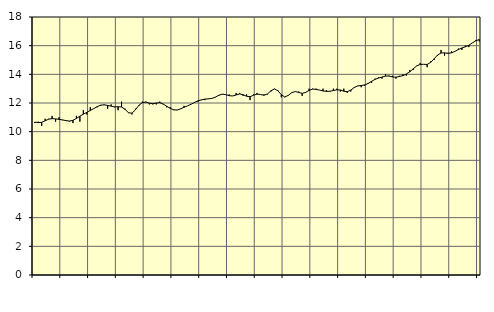
| Category | Piggar | Utbildning, SNI 85 |
|---|---|---|
| nan | 10.6 | 10.67 |
| 87.0 | 10.7 | 10.63 |
| 87.0 | 10.4 | 10.65 |
| 87.0 | 10.9 | 10.76 |
| nan | 10.9 | 10.87 |
| 88.0 | 11.1 | 10.91 |
| 88.0 | 10.7 | 10.89 |
| 88.0 | 11 | 10.86 |
| nan | 10.8 | 10.82 |
| 89.0 | 10.8 | 10.77 |
| 89.0 | 10.7 | 10.74 |
| 89.0 | 10.6 | 10.79 |
| nan | 11.1 | 10.92 |
| 90.0 | 10.7 | 11.08 |
| 90.0 | 11.5 | 11.22 |
| 90.0 | 11.2 | 11.35 |
| nan | 11.7 | 11.48 |
| 91.0 | 11.6 | 11.61 |
| 91.0 | 11.7 | 11.75 |
| 91.0 | 11.8 | 11.85 |
| nan | 11.9 | 11.87 |
| 92.0 | 11.6 | 11.83 |
| 92.0 | 11.9 | 11.78 |
| 92.0 | 11.7 | 11.73 |
| nan | 11.5 | 11.74 |
| 93.0 | 12.1 | 11.72 |
| 93.0 | 11.6 | 11.56 |
| 93.0 | 11.3 | 11.32 |
| nan | 11.2 | 11.29 |
| 94.0 | 11.6 | 11.53 |
| 94.0 | 11.8 | 11.84 |
| 94.0 | 12.1 | 12.03 |
| nan | 12.1 | 12.06 |
| 95.0 | 11.9 | 11.99 |
| 95.0 | 11.9 | 11.95 |
| 95.0 | 11.9 | 12 |
| nan | 12.1 | 12.02 |
| 96.0 | 11.9 | 11.93 |
| 96.0 | 11.7 | 11.77 |
| 96.0 | 11.7 | 11.63 |
| nan | 11.5 | 11.53 |
| 97.0 | 11.5 | 11.51 |
| 97.0 | 11.6 | 11.59 |
| 97.0 | 11.8 | 11.7 |
| nan | 11.8 | 11.8 |
| 98.0 | 11.9 | 11.91 |
| 98.0 | 12 | 12.04 |
| 98.0 | 12.1 | 12.15 |
| nan | 12.2 | 12.22 |
| 99.0 | 12.2 | 12.27 |
| 99.0 | 12.3 | 12.29 |
| 99.0 | 12.3 | 12.32 |
| nan | 12.4 | 12.41 |
| 0.0 | 12.5 | 12.54 |
| 0.0 | 12.6 | 12.62 |
| 0.0 | 12.6 | 12.58 |
| nan | 12.6 | 12.51 |
| 1.0 | 12.5 | 12.49 |
| 1.0 | 12.7 | 12.56 |
| 1.0 | 12.7 | 12.63 |
| nan | 12.5 | 12.58 |
| 2.0 | 12.6 | 12.47 |
| 2.0 | 12.2 | 12.44 |
| 2.0 | 12.6 | 12.54 |
| nan | 12.7 | 12.62 |
| 3.0 | 12.6 | 12.59 |
| 3.0 | 12.6 | 12.54 |
| 3.0 | 12.6 | 12.63 |
| nan | 12.8 | 12.85 |
| 4.0 | 13 | 12.98 |
| 4.0 | 12.9 | 12.86 |
| 4.0 | 12.4 | 12.58 |
| nan | 12.4 | 12.42 |
| 5.0 | 12.5 | 12.53 |
| 5.0 | 12.7 | 12.72 |
| 5.0 | 12.8 | 12.8 |
| nan | 12.8 | 12.74 |
| 6.0 | 12.5 | 12.67 |
| 6.0 | 12.7 | 12.74 |
| 6.0 | 13 | 12.88 |
| nan | 13 | 12.97 |
| 7.0 | 13 | 12.95 |
| 7.0 | 12.9 | 12.9 |
| 7.0 | 13 | 12.84 |
| nan | 12.9 | 12.81 |
| 8.0 | 12.8 | 12.82 |
| 8.0 | 13 | 12.87 |
| 8.0 | 13 | 12.92 |
| nan | 12.8 | 12.91 |
| 9.0 | 13 | 12.82 |
| 9.0 | 12.7 | 12.79 |
| 9.0 | 12.8 | 12.9 |
| nan | 13.1 | 13.08 |
| 10.0 | 13.2 | 13.19 |
| 10.0 | 13.1 | 13.22 |
| 10.0 | 13.2 | 13.26 |
| nan | 13.4 | 13.36 |
| 11.0 | 13.4 | 13.51 |
| 11.0 | 13.7 | 13.65 |
| 11.0 | 13.8 | 13.74 |
| nan | 13.7 | 13.81 |
| 12.0 | 14 | 13.88 |
| 12.0 | 13.9 | 13.88 |
| 12.0 | 13.9 | 13.82 |
| nan | 13.7 | 13.8 |
| 13.0 | 13.9 | 13.85 |
| 13.0 | 14 | 13.91 |
| 13.0 | 13.9 | 14.02 |
| nan | 14.3 | 14.18 |
| 14.0 | 14.3 | 14.39 |
| 14.0 | 14.6 | 14.59 |
| 14.0 | 14.8 | 14.69 |
| nan | 14.7 | 14.7 |
| 15.0 | 14.5 | 14.69 |
| 15.0 | 14.9 | 14.83 |
| 15.0 | 15 | 15.08 |
| nan | 15.3 | 15.35 |
| 16.0 | 15.7 | 15.49 |
| 16.0 | 15.3 | 15.5 |
| 16.0 | 15.5 | 15.46 |
| nan | 15.6 | 15.5 |
| 17.0 | 15.6 | 15.6 |
| 17.0 | 15.8 | 15.73 |
| 17.0 | 15.7 | 15.84 |
| nan | 16 | 15.92 |
| 18.0 | 15.9 | 16.03 |
| 18.0 | 16.2 | 16.19 |
| 18.0 | 16.4 | 16.34 |
| nan | 16.3 | 16.43 |